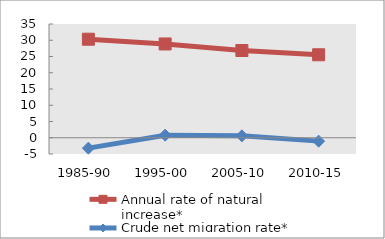
| Category | Annual rate of natural increase* | Crude net migration rate* |
|---|---|---|
| 1985-90 | 30.318 | -3.197 |
| 1995-00 | 28.859 | 0.785 |
| 2005-10 | 26.844 | 0.586 |
| 2010-15 | 25.531 | -1.04 |